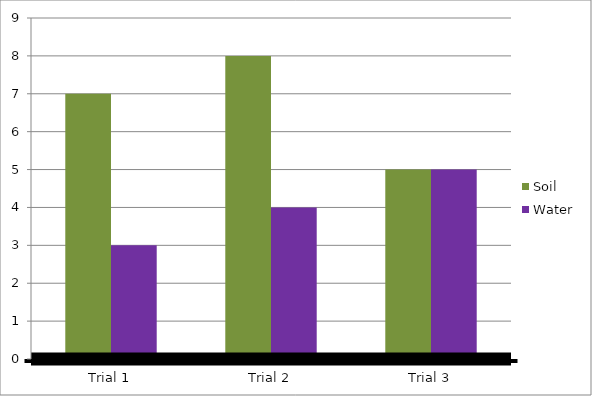
| Category | Soil | Water |
|---|---|---|
| Trial 1 | 7 | 3 |
| Trial 2 | 8 | 4 |
| Trial 3 | 5 | 5 |